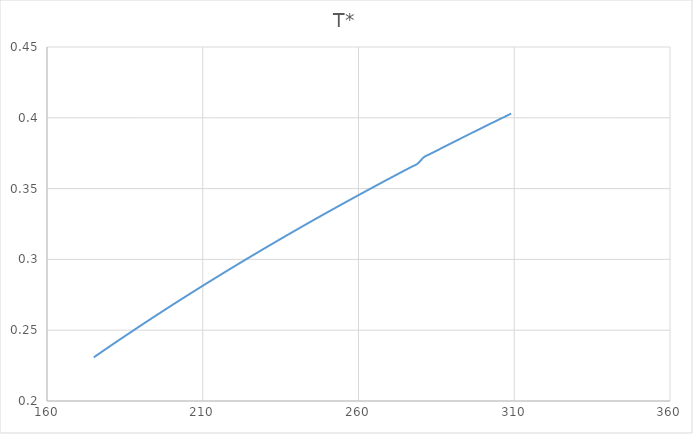
| Category | T* |
|---|---|
| 175.0 | 0.231 |
| 177.0 | 0.234 |
| 179.0 | 0.237 |
| 181.0 | 0.24 |
| 183.0 | 0.243 |
| 185.0 | 0.246 |
| 187.0 | 0.249 |
| 189.0 | 0.252 |
| 191.0 | 0.255 |
| 193.0 | 0.257 |
| 195.0 | 0.26 |
| 197.0 | 0.263 |
| 199.0 | 0.266 |
| 201.0 | 0.269 |
| 203.0 | 0.272 |
| 205.0 | 0.274 |
| 207.0 | 0.277 |
| 209.0 | 0.28 |
| 211.0 | 0.283 |
| 213.0 | 0.285 |
| 215.0 | 0.288 |
| 217.0 | 0.291 |
| 219.0 | 0.294 |
| 221.0 | 0.296 |
| 223.0 | 0.299 |
| 225.0 | 0.301 |
| 227.0 | 0.304 |
| 229.0 | 0.307 |
| 231.0 | 0.309 |
| 233.0 | 0.312 |
| 235.0 | 0.314 |
| 237.0 | 0.317 |
| 239.0 | 0.32 |
| 241.0 | 0.322 |
| 243.0 | 0.325 |
| 245.0 | 0.327 |
| 247.0 | 0.33 |
| 249.0 | 0.332 |
| 251.0 | 0.334 |
| 253.0 | 0.337 |
| 255.0 | 0.339 |
| 257.0 | 0.342 |
| 259.0 | 0.344 |
| 261.0 | 0.347 |
| 263.0 | 0.349 |
| 265.0 | 0.351 |
| 267.0 | 0.354 |
| 269.0 | 0.356 |
| 271.0 | 0.358 |
| 273.0 | 0.361 |
| 275.0 | 0.363 |
| 277.0 | 0.365 |
| 279.0 | 0.368 |
| 281.0 | 0.372 |
| 283.0 | 0.374 |
| 289.0 | 0.381 |
| 293.0 | 0.386 |
| 295.0 | 0.388 |
| 297.0 | 0.39 |
| 299.0 | 0.392 |
| 301.0 | 0.394 |
| 303.0 | 0.397 |
| 309.0 | 0.403 |